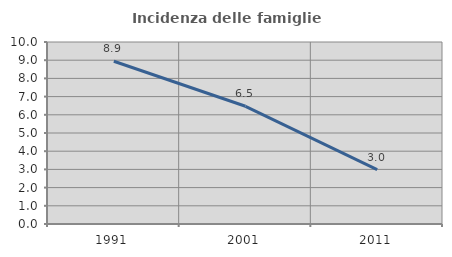
| Category | Incidenza delle famiglie numerose |
|---|---|
| 1991.0 | 8.943 |
| 2001.0 | 6.468 |
| 2011.0 | 2.985 |